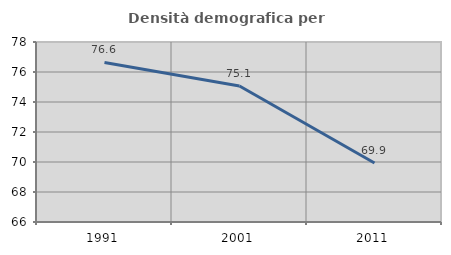
| Category | Densità demografica |
|---|---|
| 1991.0 | 76.64 |
| 2001.0 | 75.062 |
| 2011.0 | 69.933 |